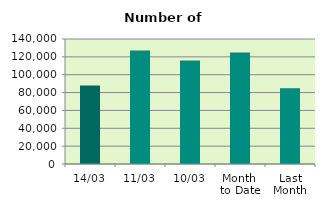
| Category | Series 0 |
|---|---|
| 14/03 | 87864 |
| 11/03 | 127054 |
| 10/03 | 115966 |
| Month 
to Date | 124923.2 |
| Last
Month | 84726.4 |